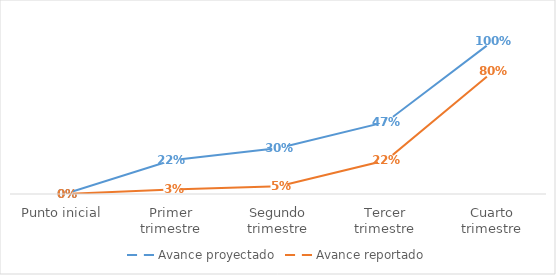
| Category | Avance proyectado | Avance reportado |
|---|---|---|
| Punto inicial | 0 | 0 |
| Primer trimestre | 0.22 | 0.03 |
| Segundo trimestre | 0.3 | 0.05 |
| Tercer trimestre | 0.47 | 0.22 |
| Cuarto trimestre | 1 | 0.8 |